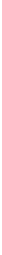
| Category | Series 0 | Series 1 | Series 2 | Series 3 | Series 4 | Series 5 | Series 6 | Series 7 | Series 8 | Series 9 | Series 10 | Series 11 | Series 12 | Series 13 |
|---|---|---|---|---|---|---|---|---|---|---|---|---|---|---|
| 2009.0 | 61854 | 4108 | 221222 | 11650 | 21423 | 398513 | 104980 | 24930 | 20054 | 34337 | 61417 |  | 154565 | 164942 |
| 2010.0 | 74869 | 4394 | 220199 | 14257 | 23522 | 419435 | 126536 | 26296 | 20034 | 35480 | 68892 |  | 152444 | 179048 |
| 2011.0 | 93889 | 4840 | 223014 | 18263 | 27751 | 468481 | 159222 | 30241 | 20832 | 38060 | 82760 |  | 153470 | 197984 |
| 2012.0 | 118759 | 5224 | 224971 | 21790 | 32523 | 532375 | 205026 | 35372 | 21819 | 41865 | 107398 |  | 155308 | 202521 |
| 2013.0 | 146828 | 5780 | 240543 | 25489 | 36316 | 609855 | 267398 | 41436 | 24094 | 0 | 135614 |  | 157455 | 184605 |
| 2014.0 | 183263 | 6023 | 263347 | 27752 | 39001 | 674152 | 355343 | 46168 | 25613 | 49985 | 156812 |  | 163519 | 202195 |
| 2015.0 | 226926 | 6286 | 297895 | 30157 | 43057 | 740962 | 452718 | 50889 | 27222 | 53908 | 178221 |  | 167975 | 212630 |
| 2016.0 | 263320 | 6540 | 332605 | 32320 | 46745 | 783085 | 533660 | 53440 | 27830 | 56085 | 192340 |  | 172560 | 205975 |